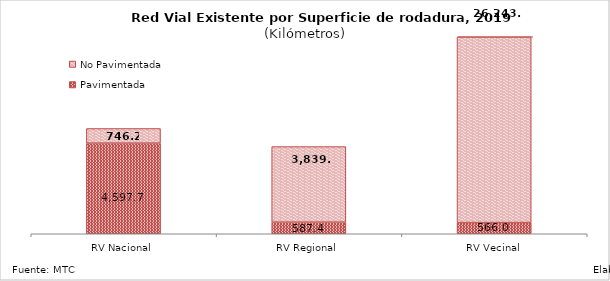
| Category | Pavimentada | No Pavimentada |
|---|---|---|
| RV Nacional | 4597.713 | 746.16 |
| RV Regional | 587.431 | 3838.967 |
| RV Vecinal | 566.044 | 26243.373 |